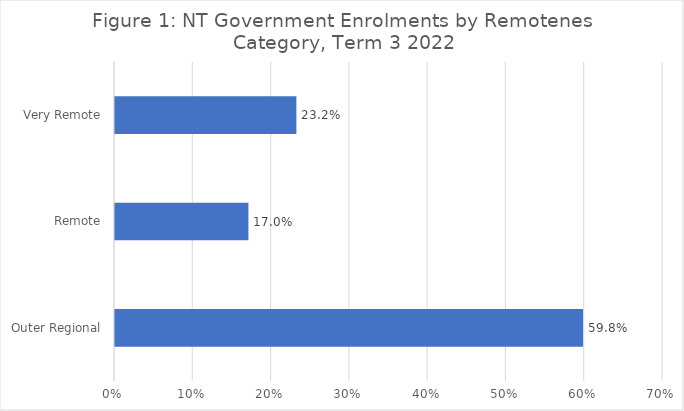
| Category | Series 0 |
|---|---|
| Outer Regional | 0.598 |
| Remote | 0.17 |
| Very Remote | 0.232 |